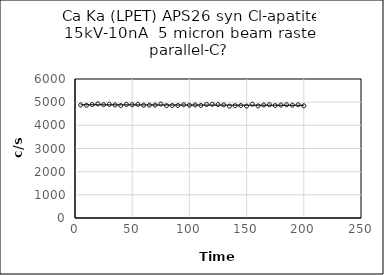
| Category | Series 0 |
|---|---|
| 5.0 | 4878.4 |
| 10.0 | 4865.6 |
| 15.0 | 4894.2 |
| 20.0 | 4924.8 |
| 25.0 | 4890.2 |
| 30.0 | 4904.8 |
| 35.0 | 4880.4 |
| 40.0 | 4853 |
| 45.0 | 4902.4 |
| 50.0 | 4887.4 |
| 55.0 | 4903 |
| 60.0 | 4868 |
| 65.0 | 4871.2 |
| 70.0 | 4873.2 |
| 75.0 | 4916.4 |
| 80.0 | 4848.6 |
| 85.0 | 4856.2 |
| 90.0 | 4857.2 |
| 95.0 | 4888.4 |
| 100.0 | 4869 |
| 105.0 | 4878.6 |
| 110.0 | 4859.6 |
| 115.0 | 4900.2 |
| 120.0 | 4909.2 |
| 125.0 | 4893.8 |
| 130.0 | 4882 |
| 135.0 | 4829.2 |
| 140.0 | 4847.4 |
| 145.0 | 4855 |
| 150.0 | 4830.4 |
| 155.0 | 4909.6 |
| 160.0 | 4839 |
| 165.0 | 4875.8 |
| 170.0 | 4889.6 |
| 175.0 | 4854.6 |
| 180.0 | 4876.6 |
| 185.0 | 4888.8 |
| 190.0 | 4871.6 |
| 195.0 | 4887.4 |
| 200.0 | 4841.8 |